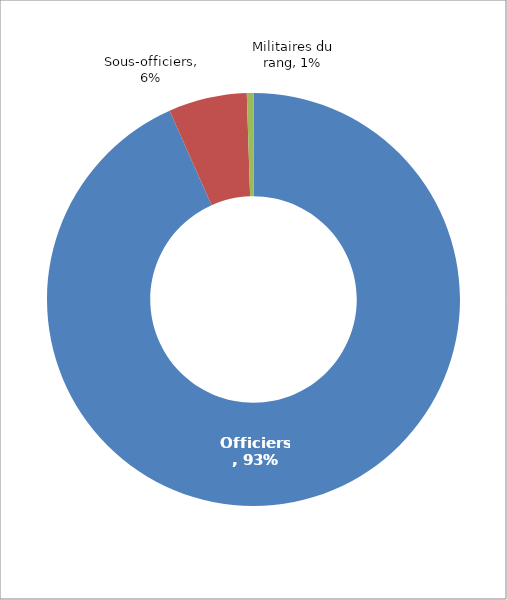
| Category | Series 0 |
|---|---|
| Officiers | 0.933 |
| Sous-officiers | 0.061 |
| Militaires du rang | 0.005 |